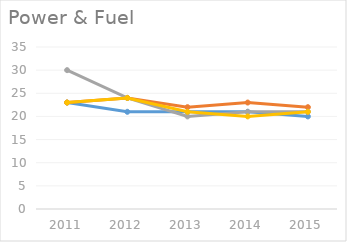
| Category | ACC Ltd | Ambuja Cement | JK Lakshmi Cement | Ultratech Cement |
|---|---|---|---|---|
| 2011 | 23 | 23 | 30 | 23 |
| 2012 | 21 | 24 | 24 | 24 |
| 2013 | 21 | 22 | 20 | 21 |
| 2014 | 21 | 23 | 21 | 20 |
| 2015 | 20 | 22 | 21 | 21 |